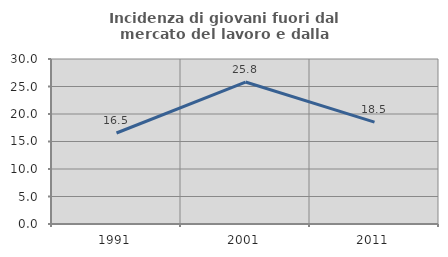
| Category | Incidenza di giovani fuori dal mercato del lavoro e dalla formazione  |
|---|---|
| 1991.0 | 16.544 |
| 2001.0 | 25.809 |
| 2011.0 | 18.534 |